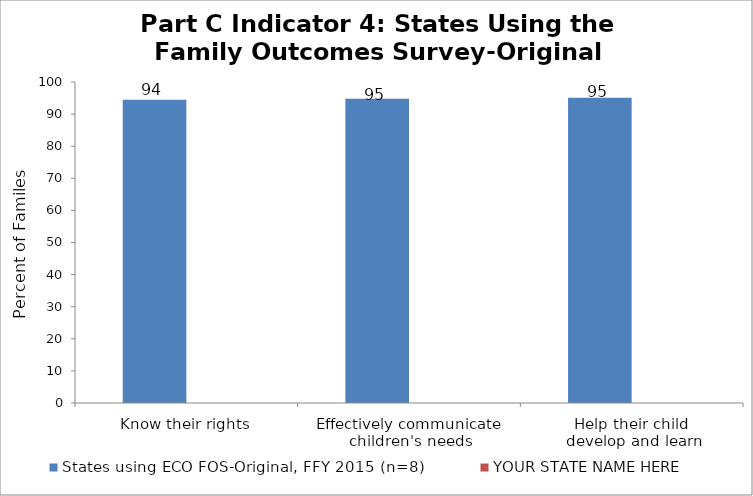
| Category | States using ECO FOS-Original, FFY 2015 (n=8) | YOUR STATE NAME HERE |
|---|---|---|
| Know their rights | 94.494 |  |
| Effectively communicate 
children's needs | 94.767 |  |
| Help their child 
develop and learn | 95.075 |  |